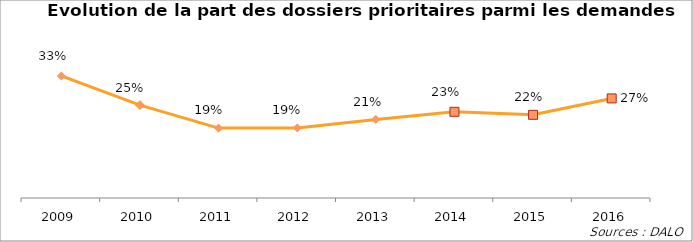
| Category | Series 1 |
|---|---|
| 2009.0 | 0.326 |
| 2010.0 | 0.248 |
| 2011.0 | 0.187 |
| 2012.0 | 0.187 |
| 2013.0 | 0.21 |
| 2014.0 | 0.23 |
| 2015.0 | 0.222 |
| 2016.0 | 0.266 |